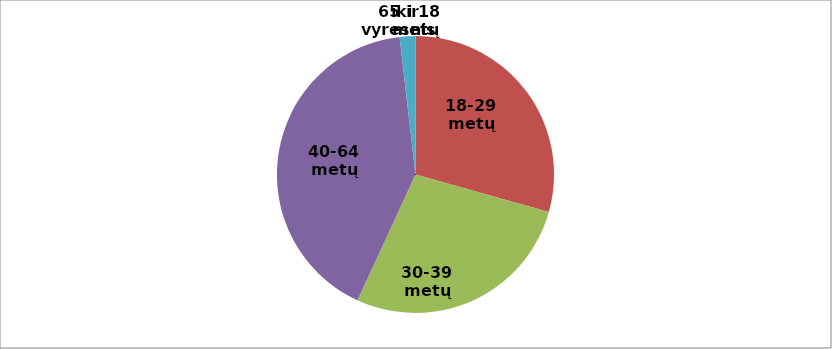
| Category | Series 0 |
|---|---|
| iki 18 metų | 0 |
| 18-29 metų | 32 |
| 30-39 metų | 30 |
| 40-64 metų | 45 |
| 65 ir vyresnis | 2 |